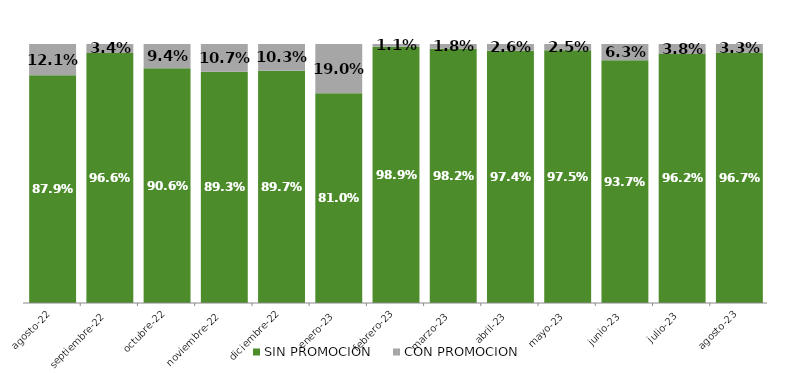
| Category | SIN PROMOCION   | CON PROMOCION   |
|---|---|---|
| 2022-08-01 | 0.879 | 0.121 |
| 2022-09-01 | 0.966 | 0.034 |
| 2022-10-01 | 0.906 | 0.094 |
| 2022-11-01 | 0.893 | 0.107 |
| 2022-12-01 | 0.897 | 0.103 |
| 2023-01-01 | 0.81 | 0.19 |
| 2023-02-01 | 0.989 | 0.011 |
| 2023-03-01 | 0.982 | 0.018 |
| 2023-04-01 | 0.974 | 0.026 |
| 2023-05-01 | 0.975 | 0.025 |
| 2023-06-01 | 0.937 | 0.063 |
| 2023-07-01 | 0.962 | 0.038 |
| 2023-08-01 | 0.967 | 0.033 |